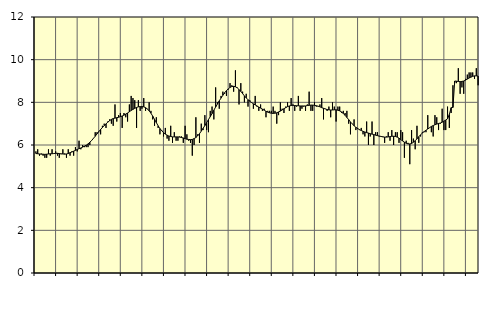
| Category | Piggar | Series 1 |
|---|---|---|
| nan | 5.7 | 5.6 |
| 1.0 | 5.8 | 5.59 |
| 1.0 | 5.5 | 5.58 |
| 1.0 | 5.6 | 5.57 |
| 1.0 | 5.5 | 5.57 |
| 1.0 | 5.4 | 5.56 |
| 1.0 | 5.4 | 5.57 |
| 1.0 | 5.8 | 5.58 |
| 1.0 | 5.5 | 5.59 |
| 1.0 | 5.8 | 5.59 |
| 1.0 | 5.6 | 5.6 |
| 1.0 | 5.7 | 5.61 |
| nan | 5.5 | 5.61 |
| 2.0 | 5.4 | 5.6 |
| 2.0 | 5.6 | 5.58 |
| 2.0 | 5.8 | 5.58 |
| 2.0 | 5.6 | 5.57 |
| 2.0 | 5.4 | 5.58 |
| 2.0 | 5.8 | 5.6 |
| 2.0 | 5.5 | 5.64 |
| 2.0 | 5.7 | 5.67 |
| 2.0 | 5.5 | 5.71 |
| 2.0 | 5.9 | 5.75 |
| 2.0 | 5.7 | 5.79 |
| nan | 6.2 | 5.83 |
| 3.0 | 5.8 | 5.86 |
| 3.0 | 6 | 5.9 |
| 3.0 | 5.9 | 5.95 |
| 3.0 | 5.9 | 5.99 |
| 3.0 | 5.9 | 6.05 |
| 3.0 | 6 | 6.13 |
| 3.0 | 6.2 | 6.21 |
| 3.0 | 6.3 | 6.31 |
| 3.0 | 6.6 | 6.41 |
| 3.0 | 6.6 | 6.52 |
| 3.0 | 6.6 | 6.63 |
| nan | 6.5 | 6.73 |
| 4.0 | 6.9 | 6.82 |
| 4.0 | 7 | 6.91 |
| 4.0 | 6.8 | 6.99 |
| 4.0 | 7.1 | 7.07 |
| 4.0 | 7.2 | 7.14 |
| 4.0 | 7 | 7.2 |
| 4.0 | 6.9 | 7.24 |
| 4.0 | 7.9 | 7.26 |
| 4.0 | 7.1 | 7.28 |
| 4.0 | 7.4 | 7.3 |
| 4.0 | 7.5 | 7.33 |
| nan | 6.8 | 7.36 |
| 5.0 | 7.5 | 7.4 |
| 5.0 | 7.3 | 7.45 |
| 5.0 | 7.1 | 7.5 |
| 5.0 | 7.9 | 7.56 |
| 5.0 | 8.3 | 7.62 |
| 5.0 | 8.2 | 7.67 |
| 5.0 | 8.1 | 7.72 |
| 5.0 | 6.8 | 7.76 |
| 5.0 | 8.1 | 7.79 |
| 5.0 | 7.6 | 7.8 |
| 5.0 | 7.7 | 7.8 |
| nan | 8.2 | 7.79 |
| 6.0 | 7.6 | 7.75 |
| 6.0 | 7.7 | 7.69 |
| 6.0 | 8 | 7.6 |
| 6.0 | 7.6 | 7.49 |
| 6.0 | 7.2 | 7.35 |
| 6.0 | 6.9 | 7.2 |
| 6.0 | 7.3 | 7.05 |
| 6.0 | 6.8 | 6.9 |
| 6.0 | 6.5 | 6.77 |
| 6.0 | 6.7 | 6.67 |
| 6.0 | 6.4 | 6.58 |
| nan | 6.8 | 6.51 |
| 7.0 | 6.3 | 6.46 |
| 7.0 | 6.2 | 6.42 |
| 7.0 | 6.9 | 6.4 |
| 7.0 | 6.1 | 6.38 |
| 7.0 | 6.6 | 6.38 |
| 7.0 | 6.2 | 6.38 |
| 7.0 | 6.2 | 6.38 |
| 7.0 | 6.4 | 6.37 |
| 7.0 | 6.4 | 6.35 |
| 7.0 | 6.1 | 6.33 |
| 7.0 | 6.9 | 6.3 |
| nan | 6.5 | 6.27 |
| 8.0 | 6.2 | 6.26 |
| 8.0 | 6.1 | 6.25 |
| 8.0 | 5.5 | 6.26 |
| 8.0 | 6 | 6.3 |
| 8.0 | 7.3 | 6.35 |
| 8.0 | 6.5 | 6.43 |
| 8.0 | 6.1 | 6.53 |
| 8.0 | 7 | 6.65 |
| 8.0 | 6.7 | 6.78 |
| 8.0 | 7.4 | 6.91 |
| 8.0 | 6.7 | 7.05 |
| nan | 6.6 | 7.19 |
| 9.0 | 7.6 | 7.33 |
| 9.0 | 7.8 | 7.47 |
| 9.0 | 7.2 | 7.63 |
| 9.0 | 8.7 | 7.78 |
| 9.0 | 8 | 7.92 |
| 9.0 | 7.7 | 8.07 |
| 9.0 | 8.3 | 8.2 |
| 9.0 | 8.5 | 8.33 |
| 9.0 | 8.4 | 8.45 |
| 9.0 | 8.3 | 8.55 |
| 9.0 | 8.6 | 8.63 |
| nan | 8.9 | 8.7 |
| 10.0 | 8.8 | 8.74 |
| 10.0 | 8.5 | 8.75 |
| 10.0 | 9.5 | 8.73 |
| 10.0 | 8.7 | 8.68 |
| 10.0 | 7.9 | 8.6 |
| 10.0 | 8.9 | 8.51 |
| 10.0 | 8.5 | 8.41 |
| 10.0 | 8 | 8.3 |
| 10.0 | 8.4 | 8.21 |
| 10.0 | 7.8 | 8.12 |
| 10.0 | 8.1 | 8.05 |
| nan | 8 | 7.99 |
| 11.0 | 7.7 | 7.93 |
| 11.0 | 8.3 | 7.88 |
| 11.0 | 7.8 | 7.83 |
| 11.0 | 7.6 | 7.78 |
| 11.0 | 7.9 | 7.73 |
| 11.0 | 7.6 | 7.68 |
| 11.0 | 7.7 | 7.63 |
| 11.0 | 7.3 | 7.58 |
| 11.0 | 7.6 | 7.54 |
| 11.0 | 7.6 | 7.51 |
| 11.0 | 7.6 | 7.49 |
| nan | 7.8 | 7.48 |
| 12.0 | 7.6 | 7.49 |
| 12.0 | 7 | 7.51 |
| 12.0 | 7.4 | 7.55 |
| 12.0 | 8 | 7.59 |
| 12.0 | 7.7 | 7.64 |
| 12.0 | 7.5 | 7.7 |
| 12.0 | 7.8 | 7.75 |
| 12.0 | 8 | 7.8 |
| 12.0 | 7.6 | 7.83 |
| 12.0 | 8.2 | 7.85 |
| 12.0 | 7.9 | 7.86 |
| nan | 7.6 | 7.85 |
| 13.0 | 7.8 | 7.84 |
| 13.0 | 8.3 | 7.84 |
| 13.0 | 7.6 | 7.83 |
| 13.0 | 7.7 | 7.83 |
| 13.0 | 7.8 | 7.83 |
| 13.0 | 7.6 | 7.83 |
| 13.0 | 7.9 | 7.85 |
| 13.0 | 8.5 | 7.86 |
| 13.0 | 7.6 | 7.87 |
| 13.0 | 7.6 | 7.87 |
| 13.0 | 8 | 7.86 |
| nan | 7.8 | 7.84 |
| 14.0 | 7.8 | 7.82 |
| 14.0 | 7.9 | 7.79 |
| 14.0 | 8.2 | 7.75 |
| 14.0 | 7.2 | 7.72 |
| 14.0 | 7.7 | 7.69 |
| 14.0 | 7.6 | 7.66 |
| 14.0 | 7.8 | 7.65 |
| 14.0 | 7.3 | 7.64 |
| 14.0 | 8 | 7.64 |
| 14.0 | 7.8 | 7.65 |
| 14.0 | 7.1 | 7.65 |
| nan | 7.8 | 7.63 |
| 15.0 | 7.8 | 7.6 |
| 15.0 | 7.5 | 7.55 |
| 15.0 | 7.6 | 7.48 |
| 15.0 | 7.5 | 7.39 |
| 15.0 | 7.6 | 7.29 |
| 15.0 | 7 | 7.19 |
| 15.0 | 6.5 | 7.08 |
| 15.0 | 7 | 6.99 |
| 15.0 | 7.2 | 6.9 |
| 15.0 | 6.7 | 6.83 |
| 15.0 | 6.8 | 6.77 |
| nan | 6.7 | 6.72 |
| 16.0 | 6.8 | 6.68 |
| 16.0 | 6.5 | 6.64 |
| 16.0 | 6.4 | 6.61 |
| 16.0 | 7.1 | 6.58 |
| 16.0 | 6 | 6.56 |
| 16.0 | 6.4 | 6.53 |
| 16.0 | 7.1 | 6.51 |
| 16.0 | 6 | 6.49 |
| 16.0 | 6.6 | 6.46 |
| 16.0 | 6.6 | 6.44 |
| 16.0 | 6.4 | 6.42 |
| nan | 6.4 | 6.4 |
| 17.0 | 6.4 | 6.38 |
| 17.0 | 6.1 | 6.37 |
| 17.0 | 6.4 | 6.37 |
| 17.0 | 6.6 | 6.38 |
| 17.0 | 6.2 | 6.39 |
| 17.0 | 6.7 | 6.41 |
| 17.0 | 6 | 6.41 |
| 17.0 | 6.6 | 6.4 |
| 17.0 | 6.6 | 6.37 |
| 17.0 | 6.1 | 6.32 |
| 17.0 | 6.7 | 6.25 |
| nan | 6.6 | 6.19 |
| 18.0 | 5.4 | 6.13 |
| 18.0 | 6.2 | 6.08 |
| 18.0 | 6.1 | 6.05 |
| 18.0 | 5.1 | 6.05 |
| 18.0 | 6.7 | 6.07 |
| 18.0 | 6.3 | 6.13 |
| 18.0 | 5.8 | 6.2 |
| 18.0 | 6.9 | 6.29 |
| 18.0 | 6.1 | 6.39 |
| 18.0 | 6.4 | 6.48 |
| 18.0 | 6.6 | 6.56 |
| nan | 6.6 | 6.63 |
| 19.0 | 6.6 | 6.69 |
| 19.0 | 7.4 | 6.75 |
| 19.0 | 6.8 | 6.81 |
| 19.0 | 6.6 | 6.87 |
| 19.0 | 6.4 | 6.91 |
| 19.0 | 7.4 | 6.95 |
| 19.0 | 7.3 | 6.98 |
| 19.0 | 6.7 | 7.01 |
| 19.0 | 7 | 7.03 |
| 19.0 | 7.7 | 7.07 |
| 19.0 | 6.7 | 7.12 |
| nan | 6.7 | 7.17 |
| 20.0 | 7.8 | 7.23 |
| 20.0 | 6.8 | 7.43 |
| 20.0 | 7.5 | 7.75 |
| 20.0 | 8.8 | 7.76 |
| 20.0 | 8.9 | 9 |
| 20.0 | 8.9 | 8.99 |
| 20.0 | 9.6 | 8.98 |
| 20.0 | 8.4 | 8.97 |
| 20.0 | 8.7 | 8.98 |
| 20.0 | 8.4 | 9 |
| 20.0 | 9.1 | 9.04 |
| nan | 9.3 | 9.09 |
| 21.0 | 9.4 | 9.14 |
| 21.0 | 9.4 | 9.18 |
| 21.0 | 9.4 | 9.22 |
| 21.0 | 9.1 | 9.24 |
| 21.0 | 9.6 | 9.24 |
| 21.0 | 8.8 | 9.23 |